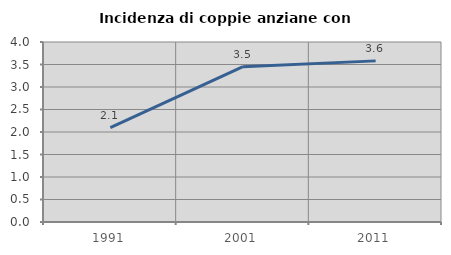
| Category | Incidenza di coppie anziane con figli |
|---|---|
| 1991.0 | 2.096 |
| 2001.0 | 3.451 |
| 2011.0 | 3.581 |